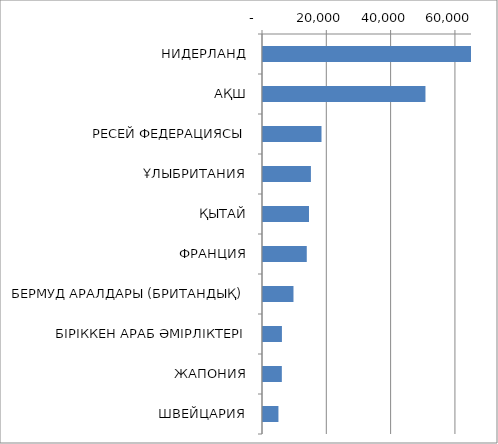
| Category | Series 0 |
|---|---|
| НИДЕРЛАНД | 65108.308 |
| АҚШ | 50526.021 |
| РЕСЕЙ ФЕДЕРАЦИЯСЫ | 18195.966 |
| ҰЛЫБРИТАНИЯ | 14901.171 |
| ҚЫТАЙ | 14302.677 |
| ФРАНЦИЯ | 13614.04 |
| БЕРМУД АРАЛДАРЫ (БРИТАНДЫҚ) | 9479.351 |
| БІРІККЕН АРАБ ӘМІРЛІКТЕРІ | 5885.276 |
| ЖАПОНИЯ | 5858.072 |
| ШВЕЙЦАРИЯ | 4801.038 |